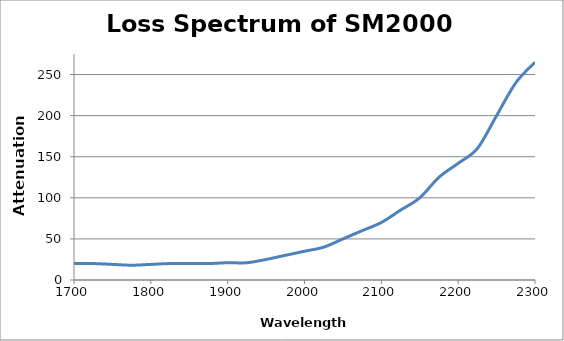
| Category | Attenuation (dB/km) |
|---|---|
| 1700.0 | 20 |
| 1725.0 | 20 |
| 1750.0 | 19 |
| 1775.0 | 18 |
| 1800.0 | 19 |
| 1825.0 | 20 |
| 1850.0 | 20 |
| 1875.0 | 20 |
| 1900.0 | 21 |
| 1925.0 | 21 |
| 1950.0 | 25 |
| 1975.0 | 30 |
| 2000.0 | 35 |
| 2025.0 | 40 |
| 2050.0 | 50 |
| 2075.0 | 60 |
| 2100.0 | 70 |
| 2125.0 | 85 |
| 2150.0 | 100 |
| 2175.0 | 125 |
| 2200.0 | 142 |
| 2225.0 | 160 |
| 2250.0 | 200 |
| 2275.0 | 240 |
| 2300.0 | 265 |